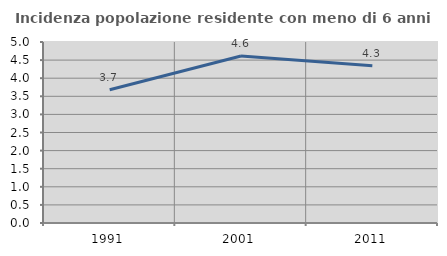
| Category | Incidenza popolazione residente con meno di 6 anni |
|---|---|
| 1991.0 | 3.681 |
| 2001.0 | 4.613 |
| 2011.0 | 4.345 |